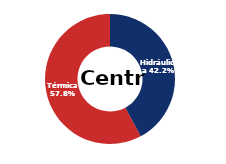
| Category | Centro |
|---|---|
| Eólica | 0 |
| Hidráulica | 1551.001 |
| Solar | 0 |
| Térmica | 2125.382 |